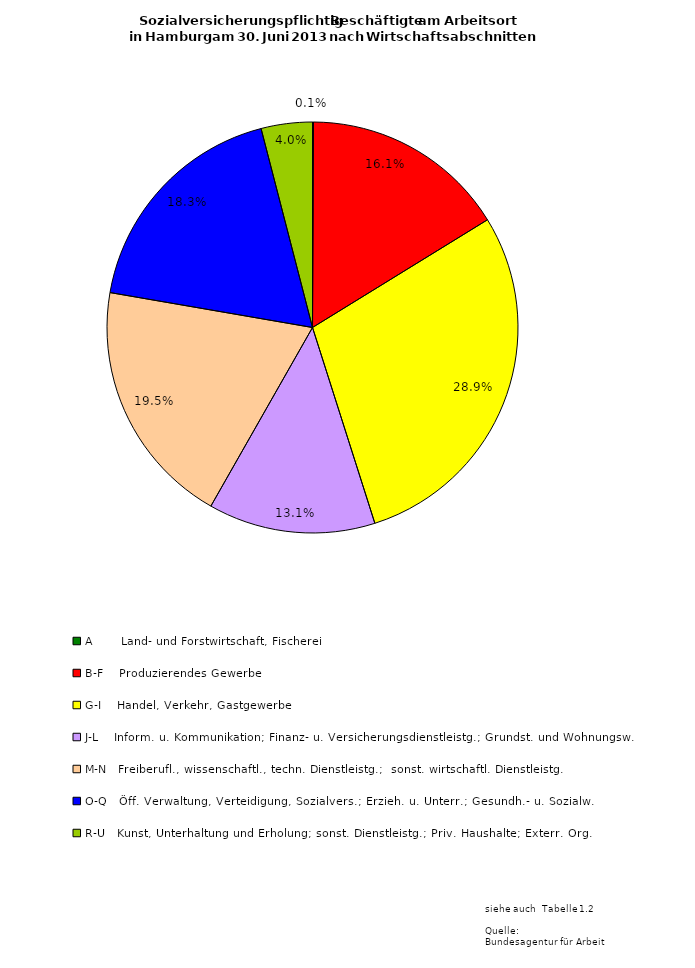
| Category | Series 0 | Series 1 | Series 2 |
|---|---|---|---|
| A       Land- und Forstwirtschaft, Fischerei | 625 | 207 | 418 |
| B-F    Produzierendes Gewerbe | 140296 | 30151 | 110145 |
| G-I    Handel, Verkehr, Gastgewerbe | 250904 | 106156 | 144748 |
| J-L    Inform. u. Kommunikation; Finanz- u. Versicherungsdienstleistg.; Grundst. und Wohnungsw. | 114197 | 51286 | 62911 |
| M-N   Freiberufl., wissenschaftl., techn. Dienstleistg.;  sonst. wirtschaftl. Dienstleistg.  | 169307 | 82739 | 86568 |
| O-Q   Öff. Verwaltung, Verteidigung, Sozialvers.; Erzieh. u. Unterr.; Gesundh.- u. Sozialw. | 158623 | 113124 | 45499 |
| R-U   Kunst, Unterhaltung und Erholung; sonst. Dienstleistg.; Priv. Haushalte; Exterr. Org. | 34990 | 21015 | 13975 |